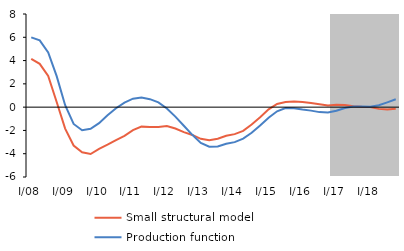
| Category | Small structural model | Production function |
|---|---|---|
| I/08 | 4.154 | 5.995 |
| II | 3.719 | 5.729 |
| III | 2.674 | 4.699 |
| IV | 0.442 | 2.662 |
| I/09 | -1.843 | 0.168 |
| II | -3.301 | -1.445 |
| III | -3.88 | -1.98 |
| IV | -4.024 | -1.864 |
| I/10 | -3.581 | -1.376 |
| II | -3.219 | -0.702 |
| III | -2.832 | -0.092 |
| IV | -2.459 | 0.393 |
| I/11 | -1.975 | 0.73 |
| II | -1.674 | 0.817 |
| III | -1.704 | 0.685 |
| IV | -1.7 | 0.408 |
| I/12 | -1.617 | -0.112 |
| II | -1.84 | -0.811 |
| III | -2.142 | -1.6 |
| IV | -2.388 | -2.377 |
| I/13 | -2.72 | -3.071 |
| II | -2.845 | -3.397 |
| III | -2.715 | -3.383 |
| IV | -2.452 | -3.147 |
| I/14 | -2.318 | -3.005 |
| II | -2.038 | -2.699 |
| III | -1.493 | -2.201 |
| IV | -0.874 | -1.584 |
| I/15 | -0.189 | -0.913 |
| II | 0.275 | -0.356 |
| III | 0.45 | -0.08 |
| IV | 0.475 | -0.1 |
| I/16 | 0.45 | -0.212 |
| II | 0.35 | -0.299 |
| III | 0.25 | -0.427 |
| IV | 0.133 | -0.463 |
| I/17 | 0.2 | -0.311 |
| II | 0.192 | -0.074 |
| III | 0.07 | 0.064 |
| IV | 0.026 | 0.06 |
| I/18 | 0.02 | 0.038 |
| II | -0.149 | 0.157 |
| III | -0.202 | 0.412 |
| IV | -0.14 | 0.679 |